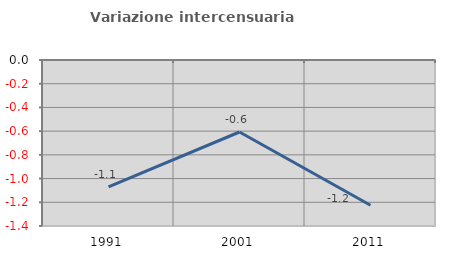
| Category | Variazione intercensuaria annua |
|---|---|
| 1991.0 | -1.071 |
| 2001.0 | -0.607 |
| 2011.0 | -1.225 |